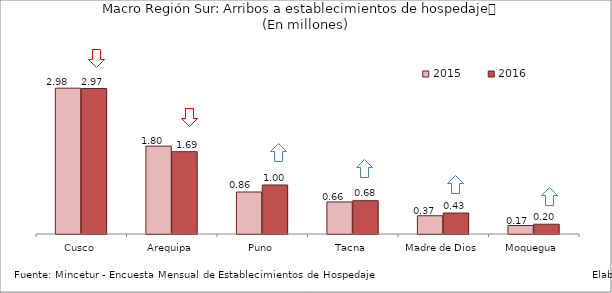
| Category | 2015 | 2016 |
|---|---|---|
| Cusco | 2.985 | 2.978 |
| Arequipa | 1.799 | 1.685 |
| Puno | 0.86 | 1.003 |
| Tacna | 0.656 | 0.682 |
| Madre de Dios | 0.374 | 0.429 |
| Moquegua | 0.174 | 0.201 |